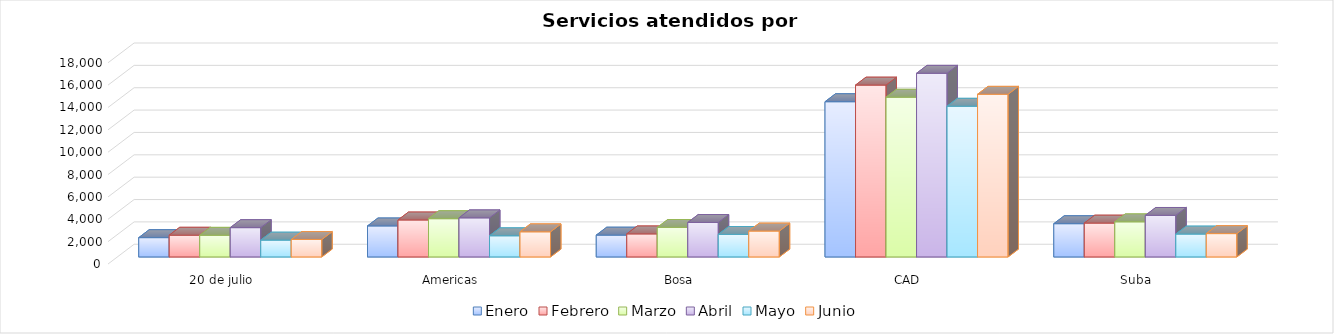
| Category | Enero | Febrero | Marzo | Abril | Mayo | Junio |
|---|---|---|---|---|---|---|
| 20 de julio | 1728 | 1945 | 1938 | 2622 | 1506 | 1559 |
| Americas | 2775 | 3308 | 3423 | 3497 | 1894 | 2249 |
| Bosa | 1953 | 2061 | 2641 | 3084 | 2016 | 2317 |
| CAD | 13884 | 15370 | 14286 | 16426 | 13480 | 14550 |
| Suba | 2975 | 3028 | 3141 | 3717 | 2048 | 2088 |